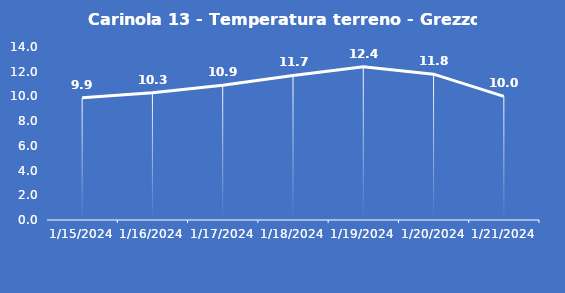
| Category | Carinola 13 - Temperatura terreno - Grezzo (°C) |
|---|---|
| 1/15/24 | 9.9 |
| 1/16/24 | 10.3 |
| 1/17/24 | 10.9 |
| 1/18/24 | 11.7 |
| 1/19/24 | 12.4 |
| 1/20/24 | 11.8 |
| 1/21/24 | 10 |